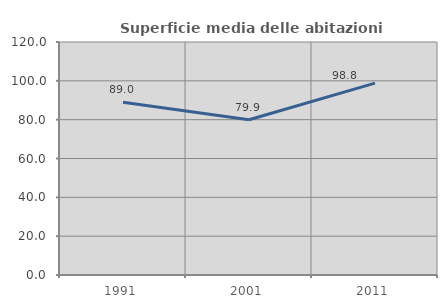
| Category | Superficie media delle abitazioni occupate |
|---|---|
| 1991.0 | 88.965 |
| 2001.0 | 79.927 |
| 2011.0 | 98.793 |